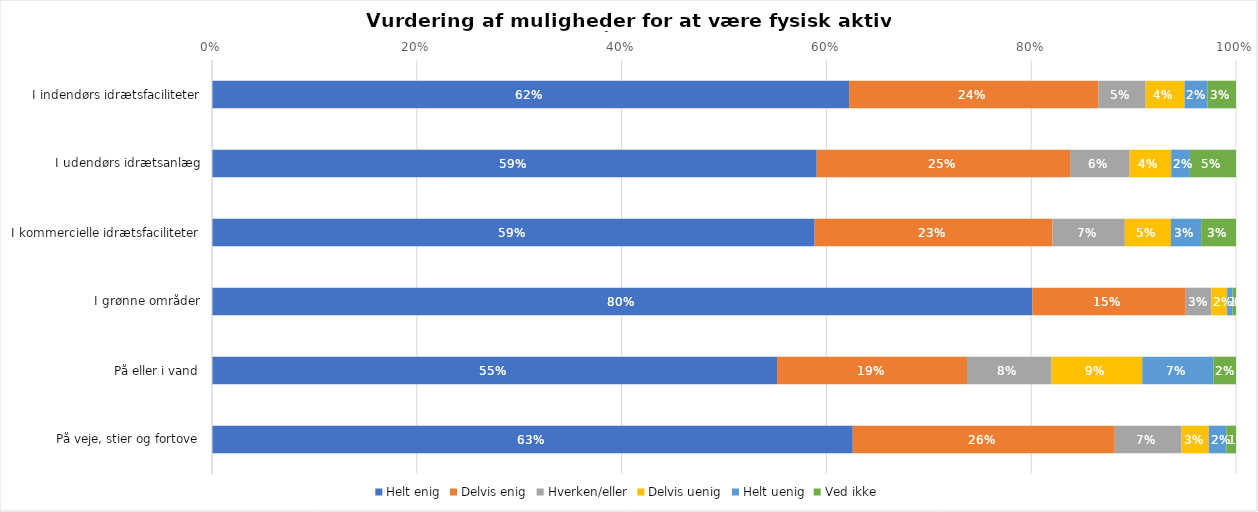
| Category | Helt enig | Delvis enig | Hverken/eller | Delvis uenig | Helt uenig | Ved ikke |
|---|---|---|---|---|---|---|
| I indendørs idrætsfaciliteter | 0.622 | 0.243 | 0.046 | 0.038 | 0.023 | 0.028 |
| I udendørs idrætsanlæg | 0.591 | 0.247 | 0.058 | 0.041 | 0.018 | 0.045 |
| I kommercielle idrætsfaciliteter | 0.589 | 0.232 | 0.071 | 0.045 | 0.03 | 0.034 |
| I grønne områder | 0.801 | 0.15 | 0.025 | 0.015 | 0.005 | 0.003 |
| På eller i vand | 0.552 | 0.185 | 0.083 | 0.089 | 0.069 | 0.022 |
| På veje, stier og fortove | 0.626 | 0.256 | 0.065 | 0.027 | 0.017 | 0.009 |